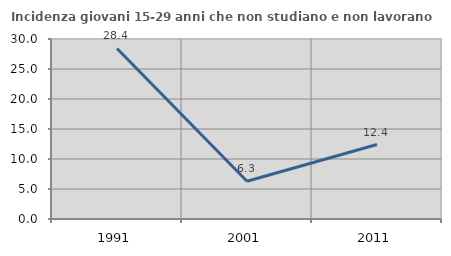
| Category | Incidenza giovani 15-29 anni che non studiano e non lavorano  |
|---|---|
| 1991.0 | 28.417 |
| 2001.0 | 6.294 |
| 2011.0 | 12.414 |